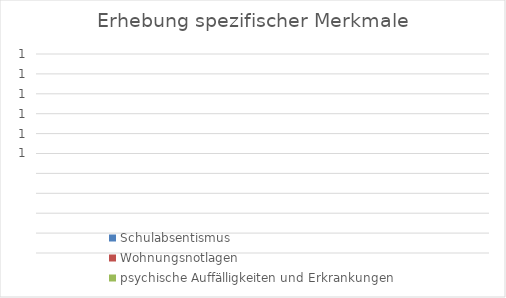
| Category | Schulabsentismus | Wohnungsnotlagen | psychische Auffälligkeiten und Erkrankungen |
|---|---|---|---|
| 0 | 0 | 0 | 0 |